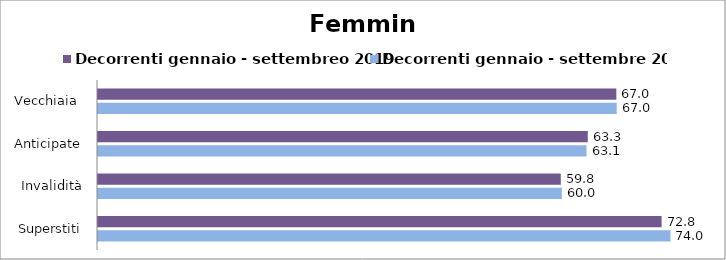
| Category | Decorrenti gennaio - settembreo 2019 | Decorrenti gennaio - settembre 2020 |
|---|---|---|
| Vecchiaia  | 66.99 | 67.04 |
|  Anticipate | 63.3 | 63.14 |
| Invalidità | 59.81 | 59.95 |
| Superstiti | 72.84 | 73.99 |